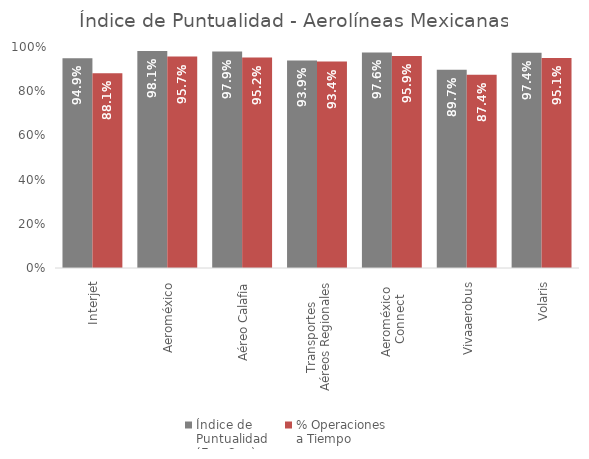
| Category | Índice de 
Puntualidad
(Ene-Sep) | % Operaciones 
a Tiempo |
|---|---|---|
| Interjet | 0.949 | 0.881 |
| Aeroméxico | 0.981 | 0.957 |
| Aéreo Calafia | 0.979 | 0.952 |
| Transportes 
Aéreos Regionales | 0.939 | 0.934 |
| Aeroméxico 
Connect | 0.976 | 0.959 |
| Vivaaerobus | 0.897 | 0.874 |
| Volaris | 0.974 | 0.951 |